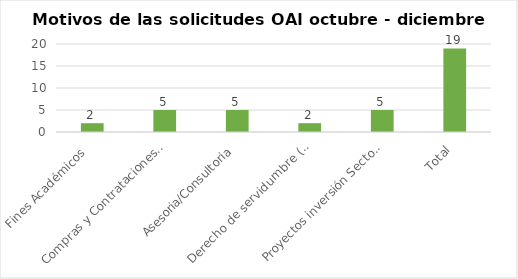
| Category | Series 0 |
|---|---|
| Fines Académicos  | 2 |
| Compras y Contrataciones Públicas | 5 |
| Asesoria/Consultoria | 5 |
| Derecho de servidumbre (paso de las lineas por terreno privado) | 2 |
| Proyectos inversión Sector Eléctrico | 5 |
| Total | 19 |